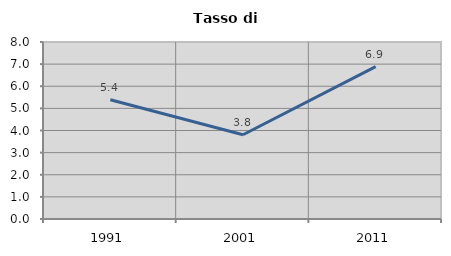
| Category | Tasso di disoccupazione   |
|---|---|
| 1991.0 | 5.387 |
| 2001.0 | 3.807 |
| 2011.0 | 6.889 |